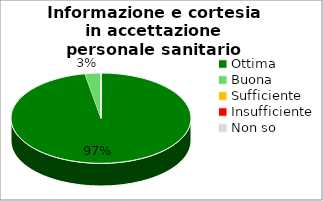
| Category | Informazione e cortesia in accettazione personale sanitario |
|---|---|
| Ottima | 34 |
| Buona | 1 |
| Sufficiente | 0 |
| Insufficiente | 0 |
| Non so | 0 |